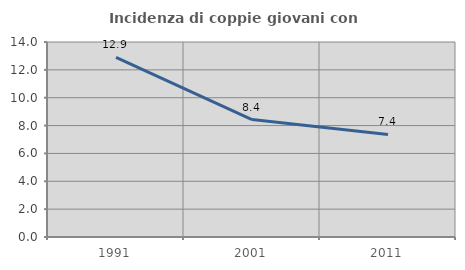
| Category | Incidenza di coppie giovani con figli |
|---|---|
| 1991.0 | 12.891 |
| 2001.0 | 8.431 |
| 2011.0 | 7.362 |